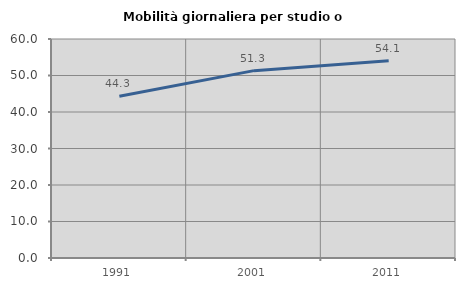
| Category | Mobilità giornaliera per studio o lavoro |
|---|---|
| 1991.0 | 44.301 |
| 2001.0 | 51.332 |
| 2011.0 | 54.066 |